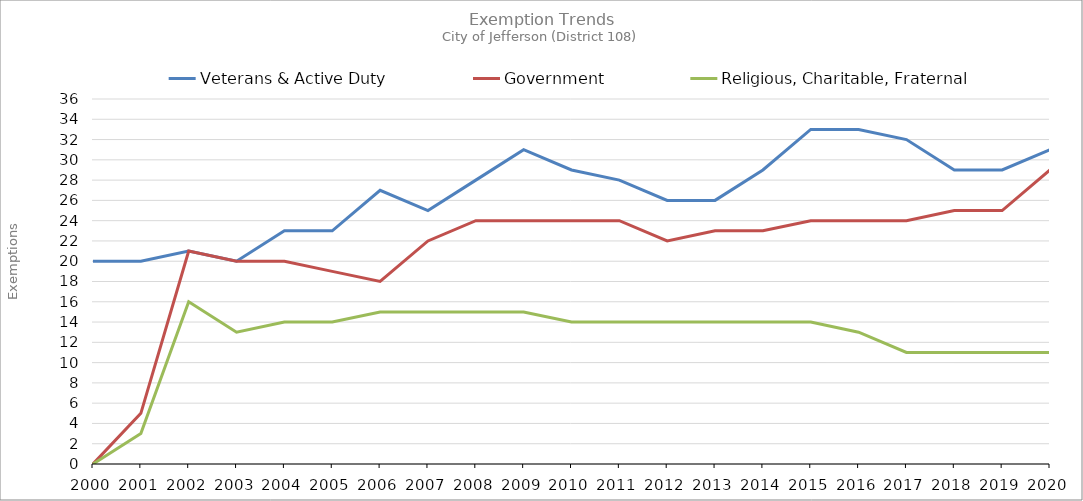
| Category | Veterans & Active Duty | Government | Religious, Charitable, Fraternal |
|---|---|---|---|
| 2000.0 | 20 | 0 | 0 |
| 2001.0 | 20 | 5 | 3 |
| 2002.0 | 21 | 21 | 16 |
| 2003.0 | 20 | 20 | 13 |
| 2004.0 | 23 | 20 | 14 |
| 2005.0 | 23 | 19 | 14 |
| 2006.0 | 27 | 18 | 15 |
| 2007.0 | 25 | 22 | 15 |
| 2008.0 | 28 | 24 | 15 |
| 2009.0 | 31 | 24 | 15 |
| 2010.0 | 29 | 24 | 14 |
| 2011.0 | 28 | 24 | 14 |
| 2012.0 | 26 | 22 | 14 |
| 2013.0 | 26 | 23 | 14 |
| 2014.0 | 29 | 23 | 14 |
| 2015.0 | 33 | 24 | 14 |
| 2016.0 | 33 | 24 | 13 |
| 2017.0 | 32 | 24 | 11 |
| 2018.0 | 29 | 25 | 11 |
| 2019.0 | 29 | 25 | 11 |
| 2020.0 | 31 | 29 | 11 |